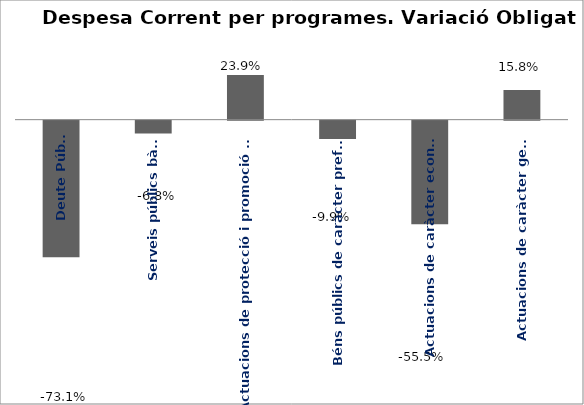
| Category | Series 0 |
|---|---|
| Deute Públic | -0.731 |
| Serveis públics bàsics | -0.068 |
| Actuacions de protecció i promoció social | 0.239 |
| Béns públics de caràcter preferent | -0.099 |
| Actuacions de caràcter econòmic | -0.555 |
| Actuacions de caràcter general | 0.158 |